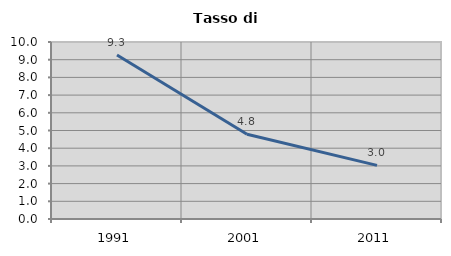
| Category | Tasso di disoccupazione   |
|---|---|
| 1991.0 | 9.268 |
| 2001.0 | 4.785 |
| 2011.0 | 3.03 |